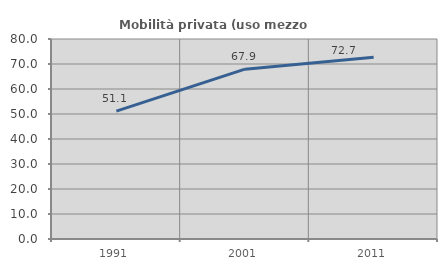
| Category | Mobilità privata (uso mezzo privato) |
|---|---|
| 1991.0 | 51.131 |
| 2001.0 | 67.921 |
| 2011.0 | 72.656 |